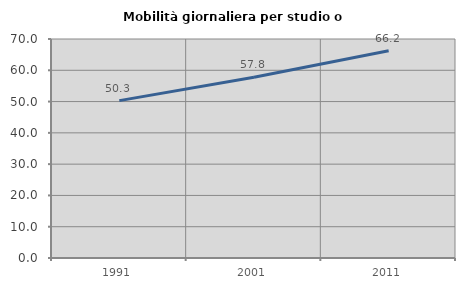
| Category | Mobilità giornaliera per studio o lavoro |
|---|---|
| 1991.0 | 50.309 |
| 2001.0 | 57.757 |
| 2011.0 | 66.234 |